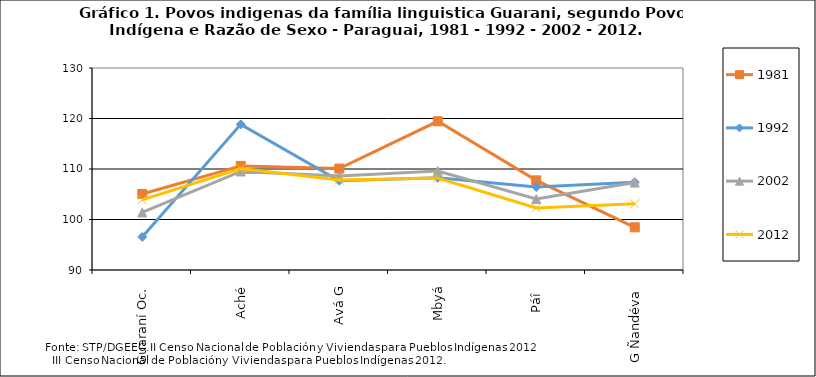
| Category | 1981 | 1992 | 2002 | 2012 |
|---|---|---|---|---|
| Guaraní Oc. | 105.042 | 96.552 | 101.402 | 103.9 |
| Aché | 110.615 | 118.836 | 109.507 | 110.1 |
| Avá G | 110.084 | 107.685 | 108.605 | 107.8 |
| Mbyá | 119.447 | 108.253 | 109.599 | 108.2 |
| Páî   | 107.75 | 106.43 | 104.071 | 102.3 |
| G Ñandéva  | 98.45 | 107.378 | 107.315 | 103.1 |